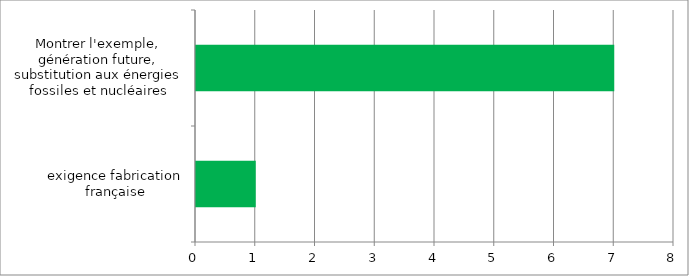
| Category | Series 0 |
|---|---|
| exigence fabrication française | 1 |
| Montrer l'exemple, génération future, substitution aux énergies fossiles et nucléaires | 7 |